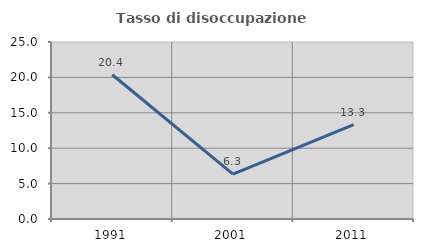
| Category | Tasso di disoccupazione giovanile  |
|---|---|
| 1991.0 | 20.37 |
| 2001.0 | 6.349 |
| 2011.0 | 13.333 |